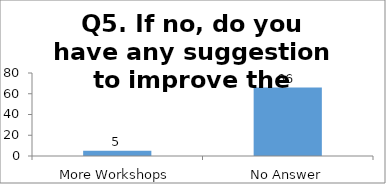
| Category | Q5. If no, do you have any suggestion to improve the quality of such session in future?  |
|---|---|
| More Workshops | 5 |
| No Answer | 66 |